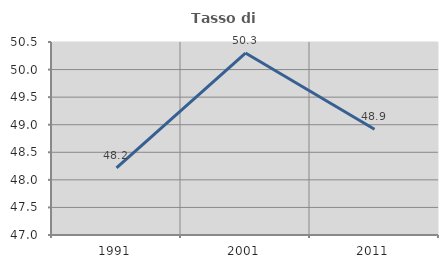
| Category | Tasso di occupazione   |
|---|---|
| 1991.0 | 48.219 |
| 2001.0 | 50.3 |
| 2011.0 | 48.917 |